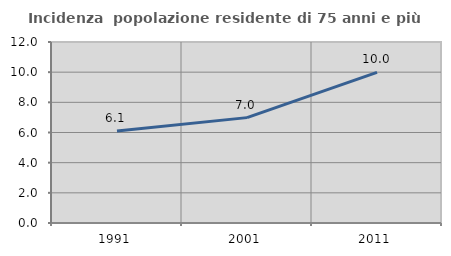
| Category | Incidenza  popolazione residente di 75 anni e più |
|---|---|
| 1991.0 | 6.096 |
| 2001.0 | 6.986 |
| 2011.0 | 9.987 |